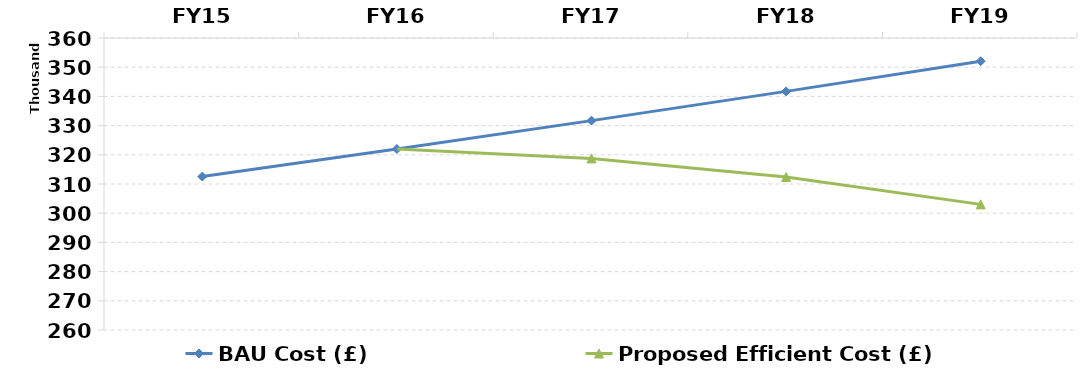
| Category | BAU Cost (£) | Proposed Efficient Cost (£) | ORR Target Usage (Costs £) |
|---|---|---|---|
| FY15 | 312545.768 | 312545.768 |  |
| FY16 | 321984.647 | 321984.647 |  |
| FY17 | 331708.583 | 318764.8 |  |
| FY18 | 341726.188 | 312389.504 |  |
| FY19 | 352046.327 | 303017.819 |  |